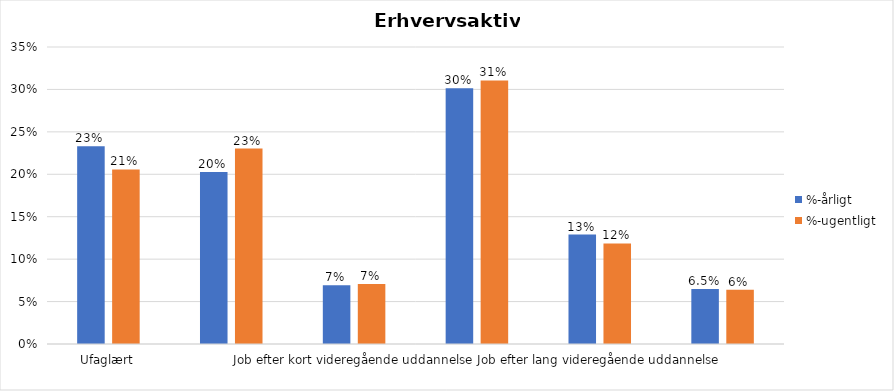
| Category | %-årligt | %-ugentligt |
|---|---|---|
| Ufaglært | 0.233 | 0.206 |
| Erhvervsfagligt job | 0.203 | 0.23 |
| Job efter kort videregående uddannelse | 0.069 | 0.071 |
| Job efter mellemlang videregående uddannelse | 0.301 | 0.311 |
| Job efter lang videregående uddannelse | 0.129 | 0.119 |
| Selvstændig | 0.065 | 0.064 |